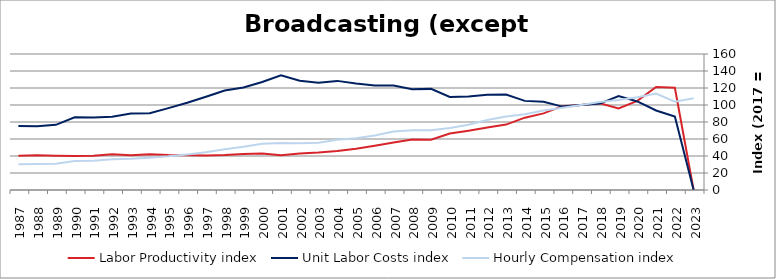
| Category | Labor Productivity index | Unit Labor Costs index | Hourly Compensation index |
|---|---|---|---|
| 2023.0 | 0 | 0 | 108.037 |
| 2022.0 | 120.304 | 86.388 | 103.929 |
| 2021.0 | 121.252 | 93.532 | 113.41 |
| 2020.0 | 104.828 | 104.213 | 109.244 |
| 2019.0 | 95.954 | 110.44 | 105.972 |
| 2018.0 | 101.952 | 101.673 | 103.658 |
| 2017.0 | 100 | 100 | 100 |
| 2016.0 | 98.677 | 98.119 | 96.821 |
| 2015.0 | 90.119 | 103.921 | 93.652 |
| 2014.0 | 85.092 | 104.851 | 89.22 |
| 2013.0 | 76.96 | 112.224 | 86.368 |
| 2012.0 | 73.507 | 111.938 | 82.283 |
| 2011.0 | 69.805 | 109.961 | 76.758 |
| 2010.0 | 66.509 | 109.506 | 72.831 |
| 2009.0 | 59.074 | 118.968 | 70.279 |
| 2008.0 | 59.299 | 118.492 | 70.265 |
| 2007.0 | 55.944 | 122.95 | 68.783 |
| 2006.0 | 52.145 | 122.881 | 64.076 |
| 2005.0 | 48.554 | 125.283 | 60.83 |
| 2004.0 | 46 | 128.374 | 59.052 |
| 2003.0 | 44.023 | 126.262 | 55.585 |
| 2002.0 | 42.827 | 128.491 | 55.029 |
| 2001.0 | 40.913 | 135.058 | 55.256 |
| 2000.0 | 42.876 | 127.059 | 54.478 |
| 1999.0 | 42.279 | 120.645 | 51.007 |
| 1998.0 | 41.046 | 117.018 | 48.031 |
| 1997.0 | 40.457 | 109.679 | 44.373 |
| 1996.0 | 40.772 | 102.698 | 41.872 |
| 1995.0 | 41.21 | 96.368 | 39.713 |
| 1994.0 | 42.175 | 90.27 | 38.071 |
| 1993.0 | 40.925 | 89.882 | 36.784 |
| 1992.0 | 41.982 | 86.109 | 36.15 |
| 1991.0 | 40.368 | 85.205 | 34.396 |
| 1990.0 | 40.027 | 85.475 | 34.213 |
| 1989.0 | 40.349 | 76.676 | 30.938 |
| 1988.0 | 40.92 | 74.969 | 30.677 |
| 1987.0 | 40.411 | 75.238 | 30.404 |